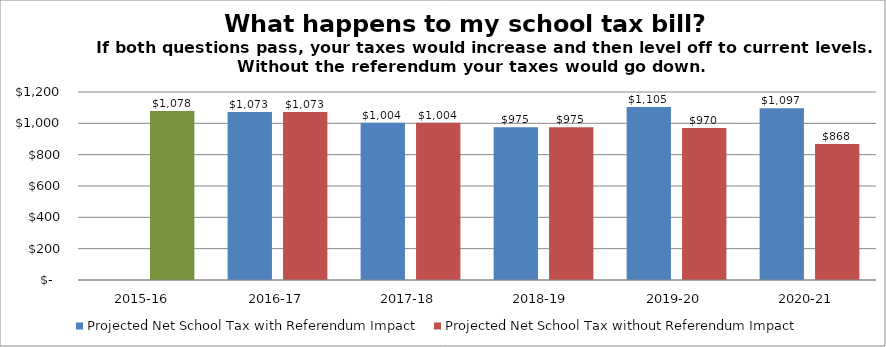
| Category | Projected Net School Tax with Referendum Impact | Projected Net School Tax without Referendum Impact |
|---|---|---|
| 2015-16 | 0 | 1078 |
| 2016-17 | 1073 | 1073 |
| 2017-18 | 1004 | 1004 |
| 2018-19  | 975 | 975 |
| 2019-20 | 1105 | 970 |
| 2020-21  | 1097 | 868 |